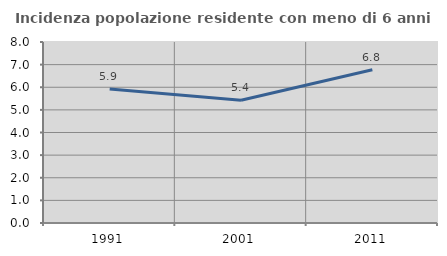
| Category | Incidenza popolazione residente con meno di 6 anni |
|---|---|
| 1991.0 | 5.919 |
| 2001.0 | 5.424 |
| 2011.0 | 6.777 |